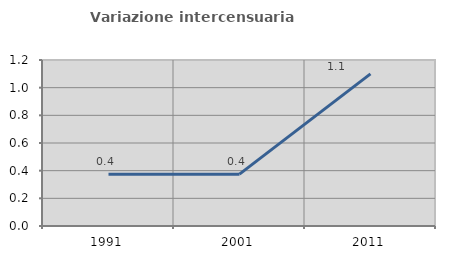
| Category | Variazione intercensuaria annua |
|---|---|
| 1991.0 | 0.374 |
| 2001.0 | 0.375 |
| 2011.0 | 1.099 |